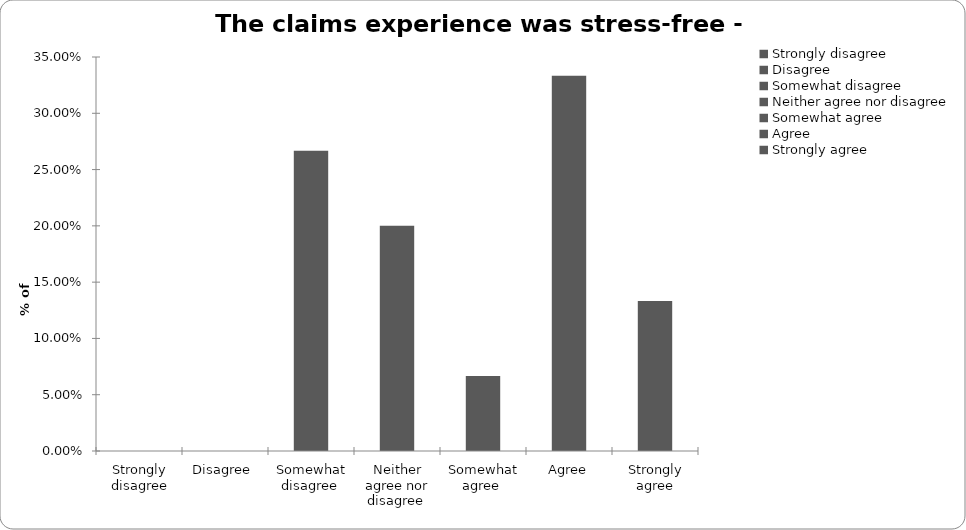
| Category | Series 2 |
|---|---|
| Strongly disagree | 0 |
| Disagree  | 0 |
| Somewhat disagree  | 0.267 |
| Neither agree nor disagree  | 0.2 |
| Somewhat agree  | 0.067 |
| Agree | 0.333 |
| Strongly agree | 0.133 |